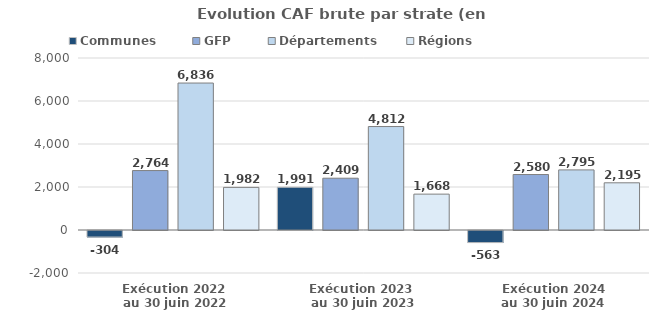
| Category | Communes  | GFP | Départements | Régions |
|---|---|---|---|---|
| Exécution 2022
 au 30 juin 2022 | -303.8 | 2764.1 | 6835.7 | 1982.4 |
| Exécution 2023 
au 30 juin 2023 | 1991.3 | 2408.6 | 4812.3 | 1667.9 |
| Exécution 2024
au 30 juin 2024 | -562.7 | 2580 | 2795.3 | 2195.3 |